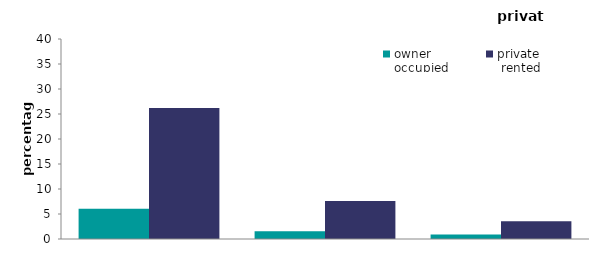
| Category | owner 
occupied | private
 rented |
|---|---|---|
| three or less | 6.043 | 26.224 |
| four to five  | 1.575 | 7.598 |
| high rise | 0.892 | 3.526 |